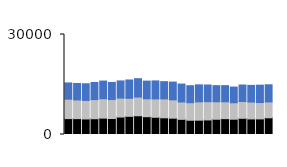
| Category | West |
|---|---|
| 0 | 4884 |
| 1 | 4927 |
| 2 | 5001 |
| 3 | 5144 |
| 4 | 5305 |
| 5 | 5135 |
| 6 | 5151 |
| 7 | 5500 |
| 8 | 5526 |
| 9 | 5303 |
| 10 | 5403 |
| 11 | 5178 |
| 12 | 5327 |
| 13 | 5369 |
| 14 | 5097 |
| 15 | 5090 |
| 16 | 5002 |
| 17 | 4847 |
| 18 | 4847 |
| 19 | 4707 |
| 20 | 4956 |
| 21 | 5002 |
| 22 | 5213 |
| 23 | 5135 |